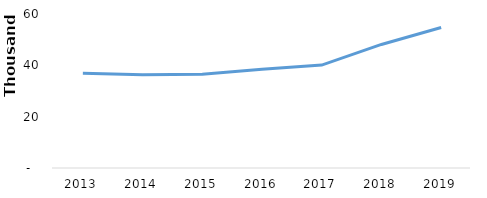
| Category | Total |
|---|---|
| 2013.0 | 36917 |
| 2014.0 | 36340 |
| 2015.0 | 36562 |
| 2016.0 | 38455 |
| 2017.0 | 40109 |
| 2018.0 | 48137 |
| 2019.0 | 54762 |